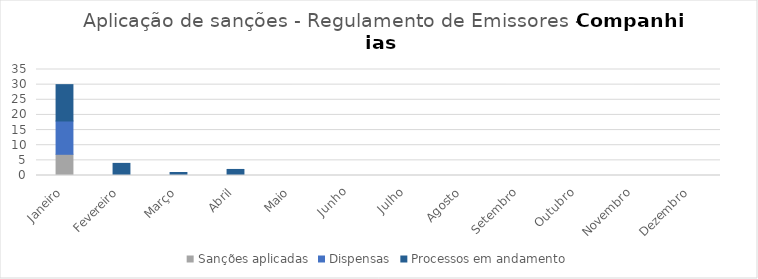
| Category | Sanções aplicadas | Dispensas | Processos em andamento |
|---|---|---|---|
| Janeiro | 7 | 11 | 12 |
| Fevereiro | 0 | 0 | 4 |
| Março | 0 | 0 | 1 |
| Abril | 0 | 0 | 2 |
| Maio | 0 | 0 | 0 |
| Junho | 0 | 0 | 0 |
| Julho | 0 | 0 | 0 |
| Agosto | 0 | 0 | 0 |
| Setembro | 0 | 0 | 0 |
| Outubro | 0 | 0 | 0 |
| Novembro | 0 | 0 | 0 |
| Dezembro | 0 | 0 | 0 |